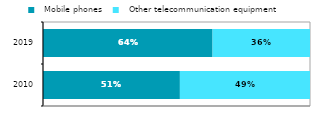
| Category |   Mobile phones |   Other telecommunication equipment |
|---|---|---|
| 2010.0 | 0.513 | 0.487 |
| 2019.0 | 0.635 | 0.365 |